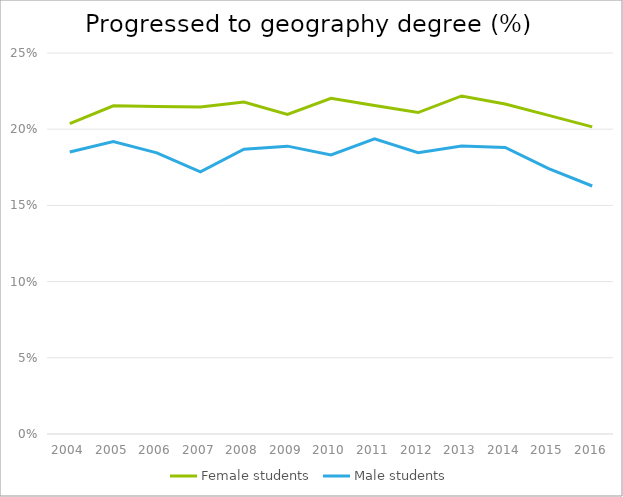
| Category | Female students | Male students |
|---|---|---|
| 2004.0 | 0.204 | 0.185 |
| 2005.0 | 0.215 | 0.192 |
| 2006.0 | 0.215 | 0.184 |
| 2007.0 | 0.215 | 0.172 |
| 2008.0 | 0.218 | 0.187 |
| 2009.0 | 0.21 | 0.189 |
| 2010.0 | 0.22 | 0.183 |
| 2011.0 | 0.215 | 0.194 |
| 2012.0 | 0.211 | 0.185 |
| 2013.0 | 0.222 | 0.189 |
| 2014.0 | 0.217 | 0.188 |
| 2015.0 | 0.209 | 0.174 |
| 2016.0 | 0.202 | 0.163 |